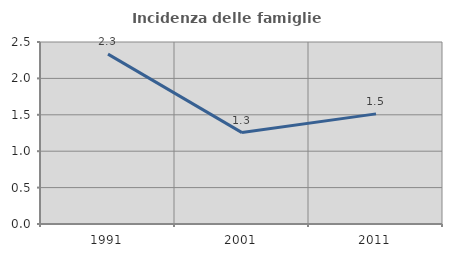
| Category | Incidenza delle famiglie numerose |
|---|---|
| 1991.0 | 2.333 |
| 2001.0 | 1.256 |
| 2011.0 | 1.513 |